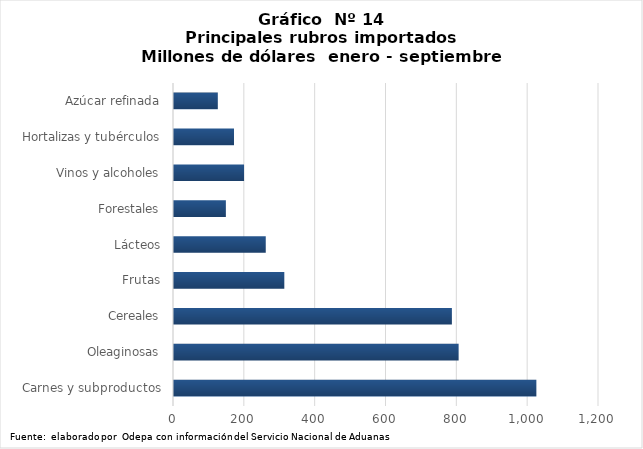
| Category | Series 0 |
|---|---|
| Carnes y subproductos | 1023164.649 |
| Oleaginosas | 803648.163 |
| Cereales | 784631.327 |
| Frutas | 311482.962 |
| Lácteos | 259071.399 |
| Forestales | 146442 |
| Vinos y alcoholes | 197805.218 |
| Hortalizas y tubérculos | 169407.141 |
| Azúcar refinada | 123722.804 |